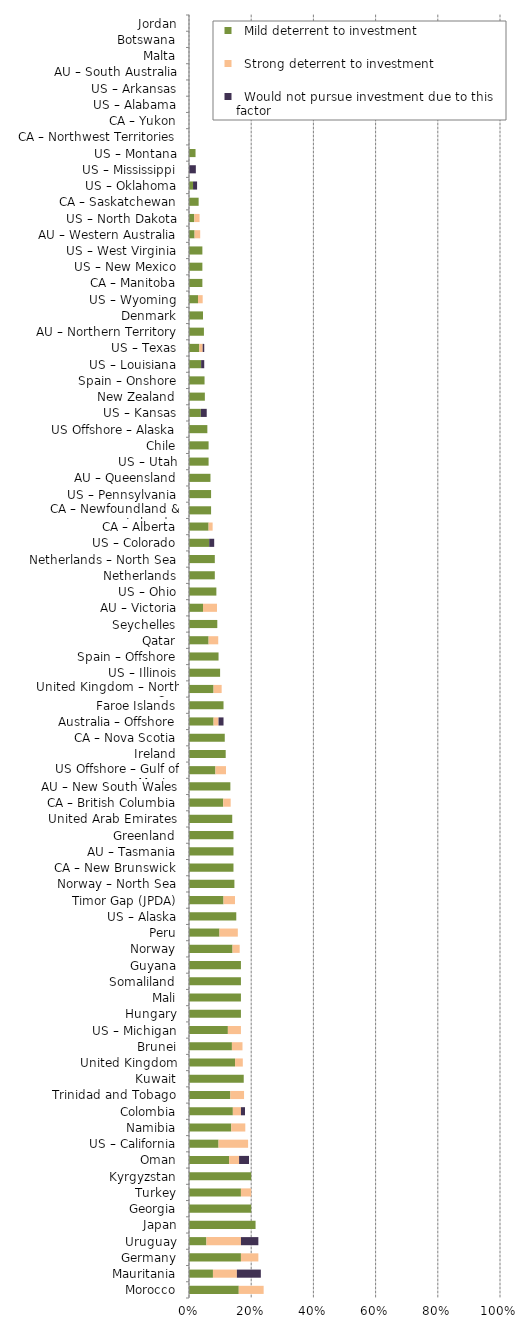
| Category |   Mild deterrent to investment |   Strong deterrent to investment |   Would not pursue investment due to this factor |
|---|---|---|---|
| Morocco | 0.16 | 0.08 | 0 |
| Mauritania | 0.077 | 0.077 | 0.077 |
| Germany | 0.167 | 0.056 | 0 |
| Uruguay | 0.056 | 0.111 | 0.056 |
| Japan | 0.214 | 0 | 0 |
| Georgia | 0.2 | 0 | 0 |
| Turkey | 0.167 | 0.033 | 0 |
| Kyrgyzstan | 0.2 | 0 | 0 |
| Oman | 0.129 | 0.032 | 0.032 |
| US – California | 0.095 | 0.095 | 0 |
| Namibia | 0.136 | 0.045 | 0 |
| Colombia | 0.141 | 0.026 | 0.013 |
| Trinidad and Tobago | 0.133 | 0.044 | 0 |
| Kuwait | 0.176 | 0 | 0 |
| United Kingdom | 0.148 | 0.025 | 0 |
| Brunei | 0.138 | 0.034 | 0 |
| US – Michigan | 0.125 | 0.042 | 0 |
| Hungary | 0.167 | 0 | 0 |
| Mali | 0.167 | 0 | 0 |
| Somaliland | 0.167 | 0 | 0 |
| Guyana | 0.167 | 0 | 0 |
| Norway | 0.14 | 0.023 | 0 |
| Peru | 0.098 | 0.059 | 0 |
| US – Alaska | 0.152 | 0 | 0 |
| Timor Gap (JPDA) | 0.111 | 0.037 | 0 |
| Norway – North Sea | 0.146 | 0 | 0 |
| CA – New Brunswick | 0.143 | 0 | 0 |
| AU – Tasmania | 0.143 | 0 | 0 |
| Greenland | 0.143 | 0 | 0 |
| United Arab Emirates | 0.139 | 0 | 0 |
| CA – British Columbia | 0.11 | 0.024 | 0 |
| AU – New South Wales | 0.133 | 0 | 0 |
| US Offshore – Gulf of Mexico | 0.085 | 0.034 | 0 |
| Ireland | 0.118 | 0 | 0 |
| CA – Nova Scotia | 0.115 | 0 | 0 |
| Australia – Offshore | 0.079 | 0.016 | 0.016 |
| Faroe Islands | 0.111 | 0 | 0 |
| United Kingdom – North Sea | 0.079 | 0.026 | 0 |
| US – Illinois | 0.1 | 0 | 0 |
| Spain – Offshore | 0.095 | 0 | 0 |
| Qatar | 0.063 | 0.031 | 0 |
| Seychelles | 0.091 | 0 | 0 |
| AU – Victoria | 0.045 | 0.045 | 0 |
| US – Ohio | 0.088 | 0 | 0 |
| Netherlands | 0.083 | 0 | 0 |
| Netherlands – North Sea | 0.083 | 0 | 0 |
| US – Colorado | 0.065 | 0 | 0.016 |
| CA – Alberta | 0.063 | 0.013 | 0 |
| CA – Newfoundland & Labrador | 0.071 | 0 | 0 |
| US – Pennsylvania | 0.071 | 0 | 0 |
| AU – Queensland | 0.069 | 0 | 0 |
| US – Utah | 0.063 | 0 | 0 |
| Chile | 0.063 | 0 | 0 |
| US Offshore – Alaska | 0.059 | 0 | 0 |
| US – Kansas | 0.038 | 0 | 0.019 |
| New Zealand | 0.051 | 0 | 0 |
| Spain – Onshore | 0.05 | 0 | 0 |
| US – Louisiana | 0.039 | 0 | 0.01 |
| US – Texas | 0.033 | 0.011 | 0.005 |
| AU – Northern Territory | 0.048 | 0 | 0 |
| Denmark | 0.045 | 0 | 0 |
| US – Wyoming | 0.029 | 0.015 | 0 |
| CA – Manitoba | 0.043 | 0 | 0 |
| US – New Mexico | 0.043 | 0 | 0 |
| US – West Virginia | 0.043 | 0 | 0 |
| AU – Western Australia | 0.018 | 0.018 | 0 |
| US – North Dakota | 0.017 | 0.017 | 0 |
| CA – Saskatchewan | 0.031 | 0 | 0 |
| US – Oklahoma | 0.013 | 0 | 0.013 |
| US – Mississippi | 0 | 0 | 0.022 |
| US – Montana | 0.021 | 0 | 0 |
| CA – Northwest Territories | 0 | 0 | 0 |
| CA – Yukon | 0 | 0 | 0 |
| US – Alabama | 0 | 0 | 0 |
| US – Arkansas | 0 | 0 | 0 |
| AU – South Australia | 0 | 0 | 0 |
| Malta | 0 | 0 | 0 |
| Botswana | 0 | 0 | 0 |
| Jordan | 0 | 0 | 0 |